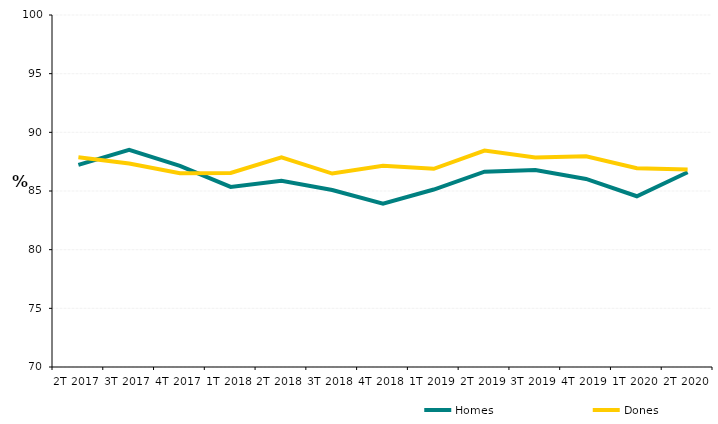
| Category | Homes | Dones |
|---|---|---|
| 2T 2017 | 87.226 | 87.881 |
| 3T 2017 | 88.507 | 87.339 |
| 4T 2017 | 87.142 | 86.507 |
| 1T 2018 | 85.345 | 86.54 |
| 2T 2018 | 85.874 | 87.877 |
| 3T 2018 | 85.086 | 86.487 |
| 4T 2018 | 83.923 | 87.155 |
| 1T 2019 | 85.126 | 86.89 |
| 2T 2019 | 86.642 | 88.448 |
| 3T 2019 | 86.783 | 87.859 |
| 4T 2019 | 86.03 | 87.959 |
| 1T 2020 | 84.553 | 86.943 |
| 2T 2020 | 86.6 | 86.837 |